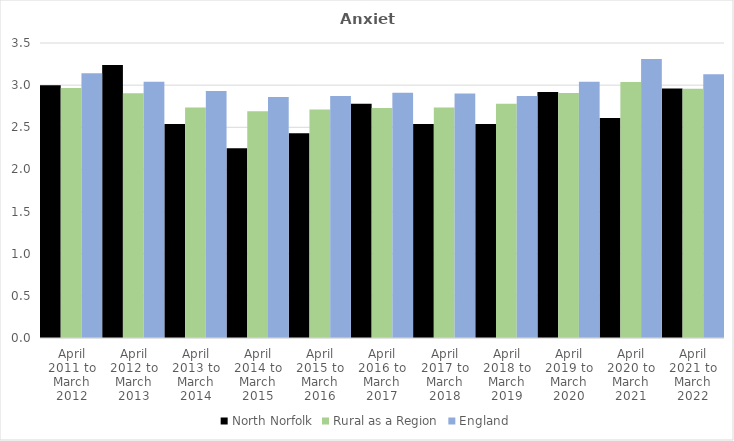
| Category | North Norfolk | Rural as a Region | England |
|---|---|---|---|
| April 2011 to March 2012 | 3 | 2.967 | 3.14 |
| April 2012 to March 2013 | 3.24 | 2.904 | 3.04 |
| April 2013 to March 2014 | 2.54 | 2.734 | 2.93 |
| April 2014 to March 2015 | 2.25 | 2.691 | 2.86 |
| April 2015 to March 2016 | 2.43 | 2.711 | 2.87 |
| April 2016 to March 2017 | 2.78 | 2.729 | 2.91 |
| April 2017 to March 2018 | 2.54 | 2.736 | 2.9 |
| April 2018 to March 2019 | 2.54 | 2.78 | 2.87 |
| April 2019 to March 2020 | 2.92 | 2.908 | 3.04 |
| April 2020 to March 2021 | 2.61 | 3.036 | 3.31 |
| April 2021 to March 2022 | 2.96 | 2.956 | 3.13 |